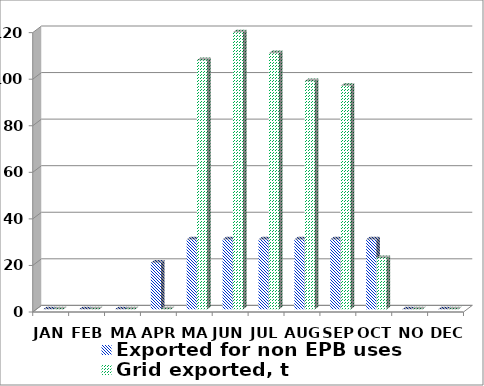
| Category | Exported for non EPB uses | Grid exported, t |
|---|---|---|
| JAN | 0 | 0 |
| FEB | 0 | 0 |
| MAR | 0 | 0 |
| APR | 20 | 0 |
| MAY | 30 | 107 |
| JUN | 30 | 119 |
| JUL | 30 | 110 |
| AUG | 30 | 98 |
| SEP | 30 | 96 |
| OCT | 30 | 22 |
| NOV | 0 | 0 |
| DEC | 0 | 0 |